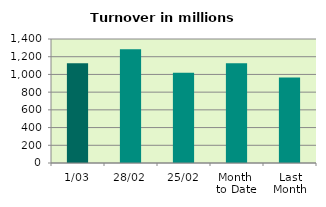
| Category | Series 0 |
|---|---|
| 1/03 | 1127.62 |
| 28/02 | 1285.565 |
| 25/02 | 1018.336 |
| Month 
to Date | 1127.62 |
| Last
Month | 966.674 |